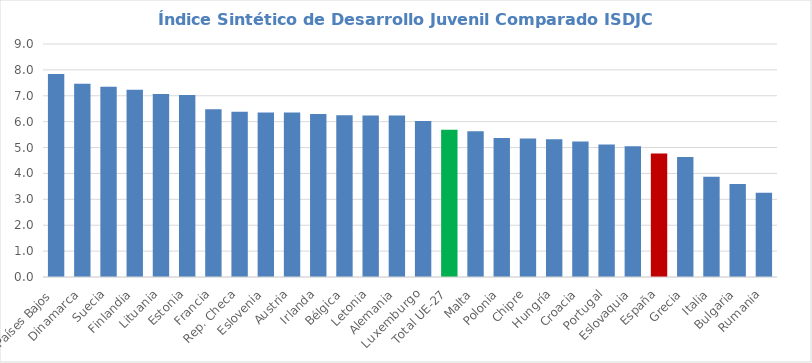
| Category | ISDJC 2022 |
|---|---|
| Países Bajos | 7.84 |
| Dinamarca | 7.467 |
| Suecia | 7.351 |
| Finlandia | 7.235 |
| Lituania | 7.069 |
| Estonia | 7.032 |
| Francia | 6.476 |
| Rep. Checa | 6.381 |
| Eslovenia | 6.353 |
| Austria | 6.35 |
| Irlanda | 6.296 |
| Bélgica | 6.244 |
| Letonia | 6.242 |
| Alemania | 6.236 |
| Luxemburgo | 6.024 |
| Total UE-27 | 5.687 |
| Malta | 5.628 |
| Polonia | 5.366 |
| Chipre | 5.354 |
| Hungría | 5.316 |
| Croacia | 5.237 |
| Portugal | 5.121 |
| Eslovaquia | 5.051 |
| España | 4.774 |
| Grecia | 4.636 |
| Italia | 3.877 |
| Bulgaria | 3.593 |
| Rumania | 3.257 |